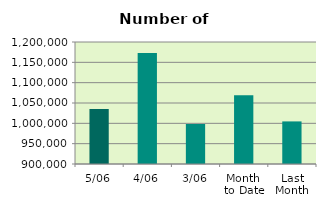
| Category | Series 0 |
|---|---|
| 5/06 | 1035150 |
| 4/06 | 1173100 |
| 3/06 | 998422 |
| Month 
to Date | 1068890.667 |
| Last
Month | 1004730.273 |